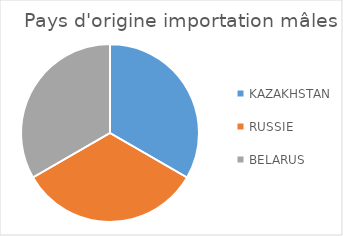
| Category | Series 0 |
|---|---|
| KAZAKHSTAN | 1 |
| RUSSIE | 1 |
| BELARUS | 1 |